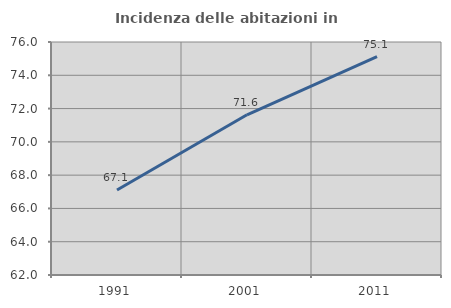
| Category | Incidenza delle abitazioni in proprietà  |
|---|---|
| 1991.0 | 67.11 |
| 2001.0 | 71.626 |
| 2011.0 | 75.117 |